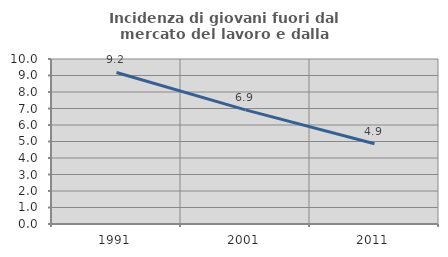
| Category | Incidenza di giovani fuori dal mercato del lavoro e dalla formazione  |
|---|---|
| 1991.0 | 9.184 |
| 2001.0 | 6.917 |
| 2011.0 | 4.867 |